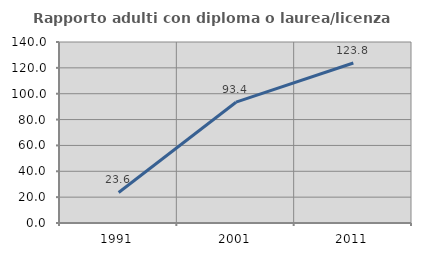
| Category | Rapporto adulti con diploma o laurea/licenza media  |
|---|---|
| 1991.0 | 23.629 |
| 2001.0 | 93.443 |
| 2011.0 | 123.774 |